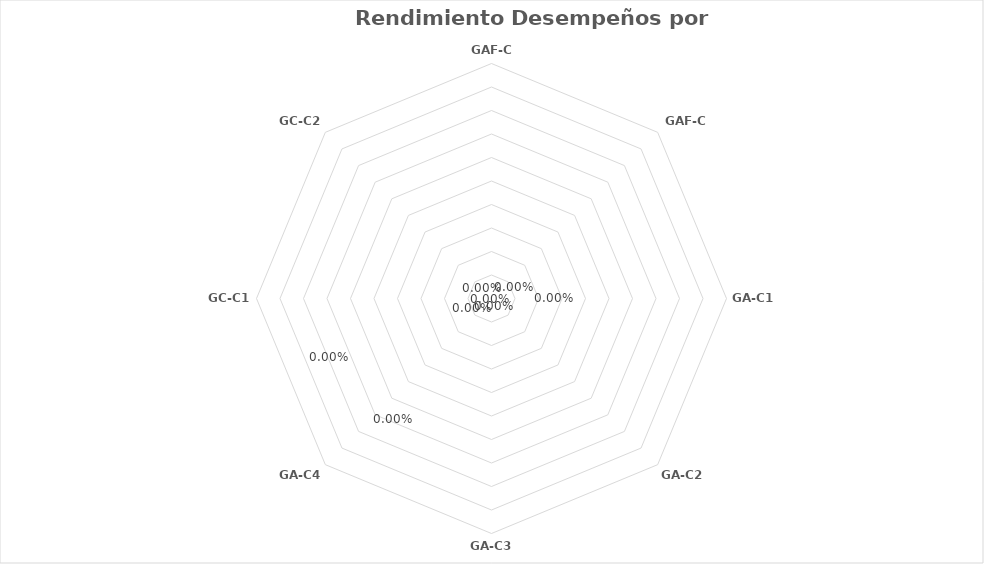
| Category | Series 0 |
|---|---|
| GAF-C1 | 0 |
| GAF-C2 | 0 |
| GA-C1 | 0 |
| GA-C2 | 0 |
| GA-C3 | 0 |
| GA-C4 | 0 |
| GC-C1 | 0 |
| GC-C2 | 0 |